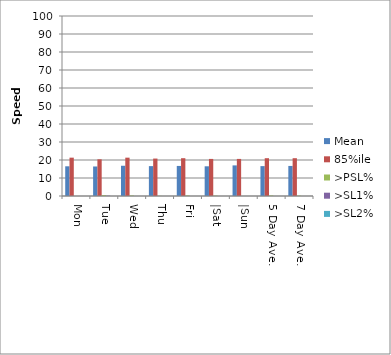
| Category | Mean | 85%ile | >PSL% | >SL1% | >SL2% |
|---|---|---|---|---|---|
| Mon | 16.5 | 21.3 | 0 | 0 | 0 |
| Tue | 16.4 | 20.4 | 0.5 | 0.2 | 0 |
| Wed | 16.8 | 21.3 | 0.3 | 0 | 0 |
| Thu | 16.6 | 20.8 | 0.1 | 0 | 0 |
| Fri | 16.7 | 21 | 0.3 | 0 | 0 |
| |Sat | 16.5 | 20.6 | 0.2 | 0 | 0 |
| |Sun | 17 | 20.6 | 0 | 0 | 0 |
| 5 Day Ave. | 16.6 | 21 | 0.31 | 0 | 0 |
| 7 Day Ave. | 16.7 | 21 | 0.2 | 0 | 0 |